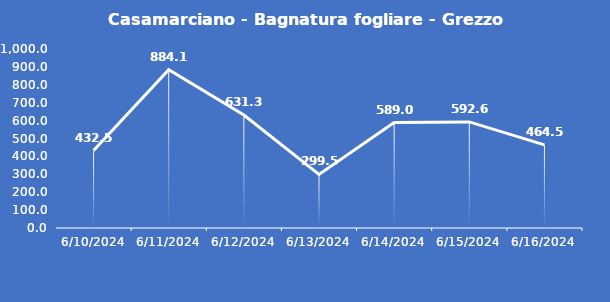
| Category | Casamarciano - Bagnatura fogliare - Grezzo (min) |
|---|---|
| 6/10/24 | 432.5 |
| 6/11/24 | 884.1 |
| 6/12/24 | 631.3 |
| 6/13/24 | 299.5 |
| 6/14/24 | 589 |
| 6/15/24 | 592.6 |
| 6/16/24 | 464.5 |